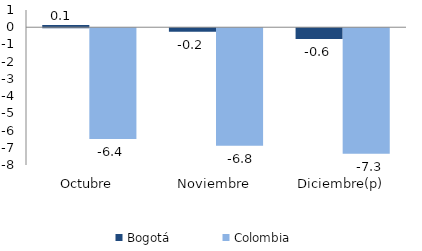
| Category | Bogotá | Colombia |
|---|---|---|
| Octubre | 0.131 | -6.427 |
| Noviembre | -0.208 | -6.824 |
| Diciembre(p) | -0.63 | -7.291 |